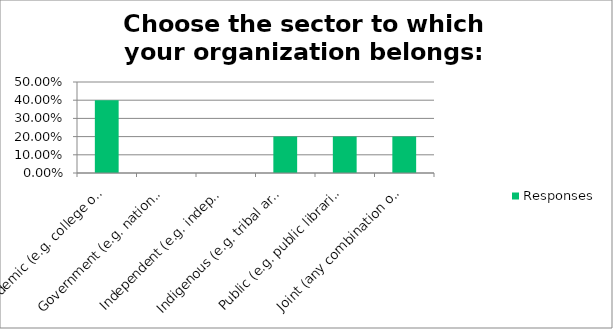
| Category | Responses |
|---|---|
| Academic (e.g. college or university archives, libraries, or museums) | 0.4 |
| Government (e.g. national, state, provincial, or municipal archives, libraries, or museums) | 0 |
| Independent (e.g. independent research or community organizations) | 0 |
| Indigenous (e.g. tribal archives, libraries, or museums) | 0.2 |
| Public (e.g. public libraries) | 0.2 |
| Joint (any combination of the above) | 0.2 |